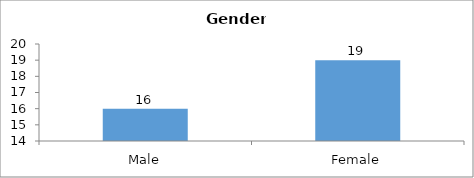
| Category | Gender |
|---|---|
| Male | 16 |
| Female | 19 |